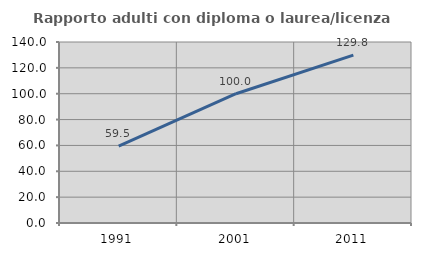
| Category | Rapporto adulti con diploma o laurea/licenza media  |
|---|---|
| 1991.0 | 59.517 |
| 2001.0 | 100 |
| 2011.0 | 129.842 |